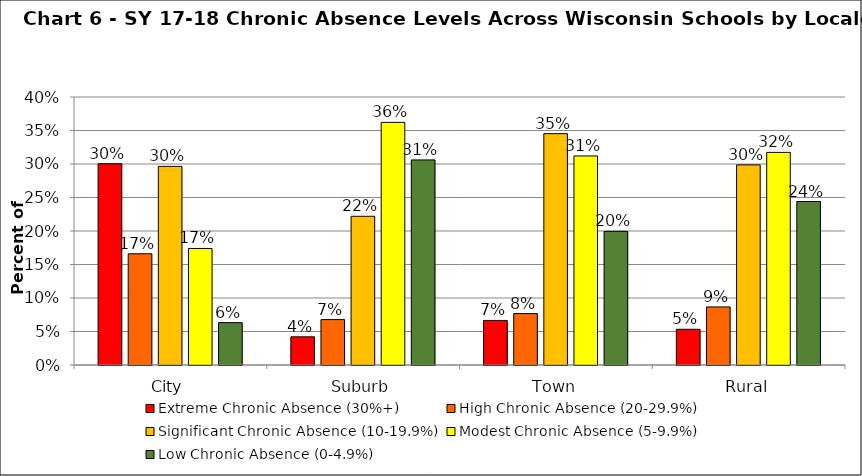
| Category | Extreme Chronic Absence (30%+) | High Chronic Absence (20-29.9%) | Significant Chronic Absence (10-19.9%) | Modest Chronic Absence (5-9.9%) | Low Chronic Absence (0-4.9%) |
|---|---|---|---|---|---|
| 0 | 0.3 | 0.166 | 0.296 | 0.174 | 0.063 |
| 1 | 0.042 | 0.068 | 0.222 | 0.362 | 0.306 |
| 2 | 0.066 | 0.077 | 0.345 | 0.312 | 0.199 |
| 3 | 0.053 | 0.087 | 0.299 | 0.317 | 0.244 |